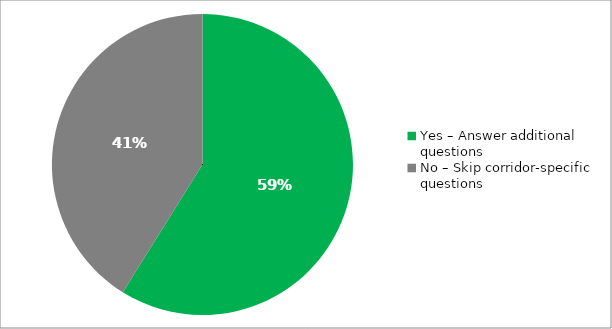
| Category | Responses |
|---|---|
| Yes – Answer additional questions | 0.589 |
| No – Skip corridor-specific questions | 0.411 |